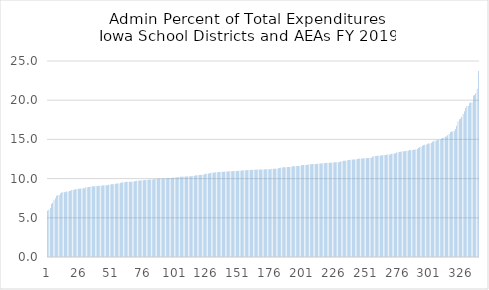
| Category | Series 0 |
|---|---|
| 0 | 5.913 |
| 1 | 6.017 |
| 2 | 6.26 |
| 3 | 6.756 |
| 4 | 6.911 |
| 5 | 7.227 |
| 6 | 7.495 |
| 7 | 7.81 |
| 8 | 7.883 |
| 9 | 7.894 |
| 10 | 8.095 |
| 11 | 8.243 |
| 12 | 8.256 |
| 13 | 8.265 |
| 14 | 8.302 |
| 15 | 8.343 |
| 16 | 8.347 |
| 17 | 8.411 |
| 18 | 8.454 |
| 19 | 8.545 |
| 20 | 8.556 |
| 21 | 8.601 |
| 22 | 8.655 |
| 23 | 8.68 |
| 24 | 8.717 |
| 25 | 8.721 |
| 26 | 8.742 |
| 27 | 8.752 |
| 28 | 8.77 |
| 29 | 8.783 |
| 30 | 8.906 |
| 31 | 8.912 |
| 32 | 8.916 |
| 33 | 8.916 |
| 34 | 9.007 |
| 35 | 9.021 |
| 36 | 9.031 |
| 37 | 9.038 |
| 38 | 9.055 |
| 39 | 9.06 |
| 40 | 9.093 |
| 41 | 9.097 |
| 42 | 9.101 |
| 43 | 9.124 |
| 44 | 9.141 |
| 45 | 9.142 |
| 46 | 9.154 |
| 47 | 9.166 |
| 48 | 9.206 |
| 49 | 9.252 |
| 50 | 9.271 |
| 51 | 9.288 |
| 52 | 9.309 |
| 53 | 9.349 |
| 54 | 9.363 |
| 55 | 9.364 |
| 56 | 9.391 |
| 57 | 9.428 |
| 58 | 9.5 |
| 59 | 9.524 |
| 60 | 9.535 |
| 61 | 9.56 |
| 62 | 9.597 |
| 63 | 9.598 |
| 64 | 9.609 |
| 65 | 9.61 |
| 66 | 9.61 |
| 67 | 9.642 |
| 68 | 9.645 |
| 69 | 9.683 |
| 70 | 9.726 |
| 71 | 9.733 |
| 72 | 9.751 |
| 73 | 9.768 |
| 74 | 9.786 |
| 75 | 9.794 |
| 76 | 9.811 |
| 77 | 9.818 |
| 78 | 9.857 |
| 79 | 9.863 |
| 80 | 9.877 |
| 81 | 9.9 |
| 82 | 9.9 |
| 83 | 9.906 |
| 84 | 9.926 |
| 85 | 9.966 |
| 86 | 9.978 |
| 87 | 10.003 |
| 88 | 10.006 |
| 89 | 10.007 |
| 90 | 10.019 |
| 91 | 10.029 |
| 92 | 10.035 |
| 93 | 10.037 |
| 94 | 10.064 |
| 95 | 10.064 |
| 96 | 10.066 |
| 97 | 10.092 |
| 98 | 10.105 |
| 99 | 10.109 |
| 100 | 10.129 |
| 101 | 10.134 |
| 102 | 10.177 |
| 103 | 10.189 |
| 104 | 10.229 |
| 105 | 10.23 |
| 106 | 10.24 |
| 107 | 10.257 |
| 108 | 10.259 |
| 109 | 10.269 |
| 110 | 10.283 |
| 111 | 10.305 |
| 112 | 10.307 |
| 113 | 10.313 |
| 114 | 10.317 |
| 115 | 10.348 |
| 116 | 10.398 |
| 117 | 10.418 |
| 118 | 10.419 |
| 119 | 10.454 |
| 120 | 10.474 |
| 121 | 10.477 |
| 122 | 10.477 |
| 123 | 10.555 |
| 124 | 10.604 |
| 125 | 10.631 |
| 126 | 10.645 |
| 127 | 10.676 |
| 128 | 10.703 |
| 129 | 10.738 |
| 130 | 10.755 |
| 131 | 10.765 |
| 132 | 10.795 |
| 133 | 10.815 |
| 134 | 10.835 |
| 135 | 10.845 |
| 136 | 10.855 |
| 137 | 10.865 |
| 138 | 10.874 |
| 139 | 10.889 |
| 140 | 10.89 |
| 141 | 10.918 |
| 142 | 10.925 |
| 143 | 10.943 |
| 144 | 10.946 |
| 145 | 10.952 |
| 146 | 10.956 |
| 147 | 10.964 |
| 148 | 10.97 |
| 149 | 10.978 |
| 150 | 10.987 |
| 151 | 11.014 |
| 152 | 11.025 |
| 153 | 11.043 |
| 154 | 11.053 |
| 155 | 11.058 |
| 156 | 11.071 |
| 157 | 11.088 |
| 158 | 11.098 |
| 159 | 11.102 |
| 160 | 11.11 |
| 161 | 11.119 |
| 162 | 11.121 |
| 163 | 11.133 |
| 164 | 11.141 |
| 165 | 11.15 |
| 166 | 11.152 |
| 167 | 11.159 |
| 168 | 11.165 |
| 169 | 11.168 |
| 170 | 11.175 |
| 171 | 11.188 |
| 172 | 11.188 |
| 173 | 11.196 |
| 174 | 11.2 |
| 175 | 11.206 |
| 176 | 11.245 |
| 177 | 11.252 |
| 178 | 11.261 |
| 179 | 11.267 |
| 180 | 11.281 |
| 181 | 11.33 |
| 182 | 11.359 |
| 183 | 11.388 |
| 184 | 11.416 |
| 185 | 11.442 |
| 186 | 11.452 |
| 187 | 11.462 |
| 188 | 11.464 |
| 189 | 11.467 |
| 190 | 11.474 |
| 191 | 11.513 |
| 192 | 11.563 |
| 193 | 11.585 |
| 194 | 11.586 |
| 195 | 11.592 |
| 196 | 11.597 |
| 197 | 11.608 |
| 198 | 11.609 |
| 199 | 11.693 |
| 200 | 11.722 |
| 201 | 11.736 |
| 202 | 11.737 |
| 203 | 11.74 |
| 204 | 11.767 |
| 205 | 11.794 |
| 206 | 11.839 |
| 207 | 11.843 |
| 208 | 11.848 |
| 209 | 11.857 |
| 210 | 11.87 |
| 211 | 11.872 |
| 212 | 11.889 |
| 213 | 11.931 |
| 214 | 11.932 |
| 215 | 11.933 |
| 216 | 11.967 |
| 217 | 11.982 |
| 218 | 11.991 |
| 219 | 11.994 |
| 220 | 12.019 |
| 221 | 12.023 |
| 222 | 12.023 |
| 223 | 12.025 |
| 224 | 12.058 |
| 225 | 12.07 |
| 226 | 12.073 |
| 227 | 12.076 |
| 228 | 12.078 |
| 229 | 12.113 |
| 230 | 12.174 |
| 231 | 12.217 |
| 232 | 12.268 |
| 233 | 12.291 |
| 234 | 12.292 |
| 235 | 12.33 |
| 236 | 12.372 |
| 237 | 12.387 |
| 238 | 12.406 |
| 239 | 12.437 |
| 240 | 12.438 |
| 241 | 12.441 |
| 242 | 12.471 |
| 243 | 12.514 |
| 244 | 12.54 |
| 245 | 12.549 |
| 246 | 12.557 |
| 247 | 12.566 |
| 248 | 12.595 |
| 249 | 12.605 |
| 250 | 12.605 |
| 251 | 12.617 |
| 252 | 12.643 |
| 253 | 12.664 |
| 254 | 12.669 |
| 255 | 12.802 |
| 256 | 12.84 |
| 257 | 12.878 |
| 258 | 12.882 |
| 259 | 12.9 |
| 260 | 12.911 |
| 261 | 12.937 |
| 262 | 12.96 |
| 263 | 12.967 |
| 264 | 12.999 |
| 265 | 13.021 |
| 266 | 13.039 |
| 267 | 13.061 |
| 268 | 13.064 |
| 269 | 13.079 |
| 270 | 13.179 |
| 271 | 13.182 |
| 272 | 13.217 |
| 273 | 13.234 |
| 274 | 13.335 |
| 275 | 13.376 |
| 276 | 13.402 |
| 277 | 13.431 |
| 278 | 13.45 |
| 279 | 13.478 |
| 280 | 13.503 |
| 281 | 13.506 |
| 282 | 13.547 |
| 283 | 13.552 |
| 284 | 13.642 |
| 285 | 13.645 |
| 286 | 13.647 |
| 287 | 13.676 |
| 288 | 13.68 |
| 289 | 13.751 |
| 290 | 13.77 |
| 291 | 13.91 |
| 292 | 14.046 |
| 293 | 14.062 |
| 294 | 14.195 |
| 295 | 14.287 |
| 296 | 14.31 |
| 297 | 14.316 |
| 298 | 14.451 |
| 299 | 14.464 |
| 300 | 14.468 |
| 301 | 14.54 |
| 302 | 14.699 |
| 303 | 14.753 |
| 304 | 14.824 |
| 305 | 14.851 |
| 306 | 14.948 |
| 307 | 14.948 |
| 308 | 14.979 |
| 309 | 15.127 |
| 310 | 15.167 |
| 311 | 15.198 |
| 312 | 15.329 |
| 313 | 15.354 |
| 314 | 15.529 |
| 315 | 15.683 |
| 316 | 15.954 |
| 317 | 16.004 |
| 318 | 16.013 |
| 319 | 16.095 |
| 320 | 16.326 |
| 321 | 16.748 |
| 322 | 17.294 |
| 323 | 17.58 |
| 324 | 17.648 |
| 325 | 17.886 |
| 326 | 18.227 |
| 327 | 18.575 |
| 328 | 19.02 |
| 329 | 19.249 |
| 330 | 19.252 |
| 331 | 19.615 |
| 332 | 19.713 |
| 333 | 19.749 |
| 334 | 20.593 |
| 335 | 20.663 |
| 336 | 20.861 |
| 337 | 21.472 |
| 338 | 23.711 |